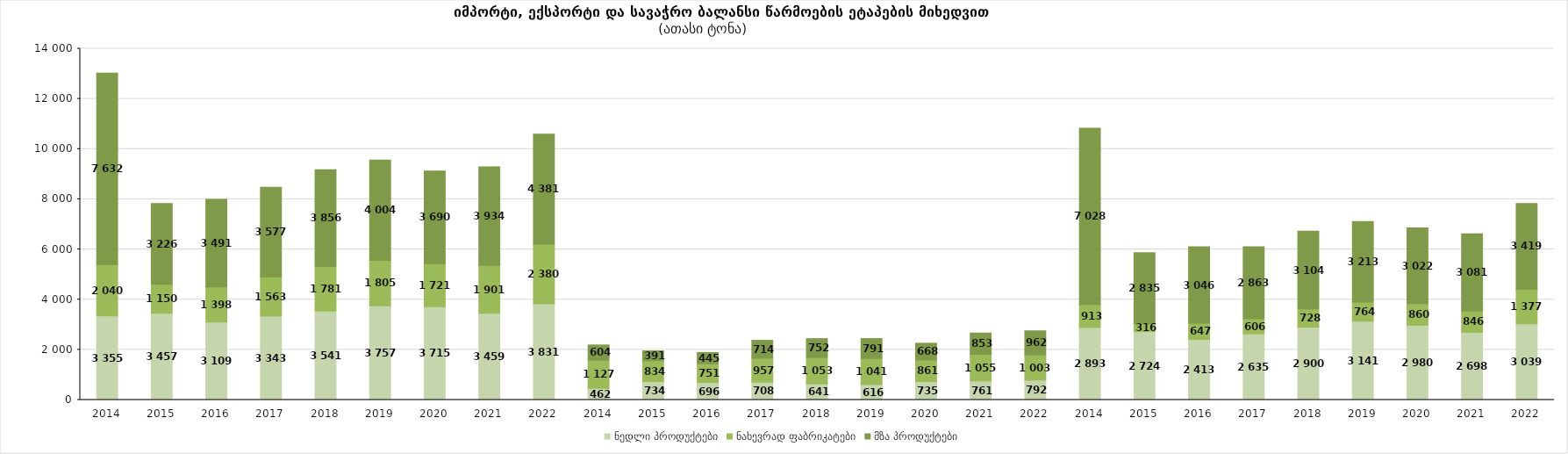
| Category | ნედლი პროდუქტები | ნახევრად ფაბრიკატები | მზა პროდუქტები |
|---|---|---|---|
| 2014.0 | 3355 | 2040 | 7632 |
| 2015.0 | 3457 | 1150 | 3226 |
| 2016.0 | 3109 | 1398 | 3491 |
| 2017.0 | 3343 | 1563 | 3577 |
| 2018.0 | 3541 | 1781 | 3856 |
| 2019.0 | 3757 | 1805 | 4004 |
| 2020.0 | 3715 | 1721 | 3690 |
| 2021.0 | 3459 | 1901 | 3934 |
| 2022.0 | 3831 | 2380 | 4381 |
| 2014.0 | 462 | 1127 | 604 |
| 2015.0 | 734 | 834 | 391 |
| 2016.0 | 696 | 751 | 445 |
| 2017.0 | 708 | 957 | 714 |
| 2018.0 | 641 | 1053 | 752 |
| 2019.0 | 616 | 1041 | 791 |
| 2020.0 | 735 | 861 | 668 |
| 2021.0 | 761 | 1055 | 853 |
| 2022.0 | 792 | 1003 | 962 |
| 2014.0 | 2893 | 913 | 7028 |
| 2015.0 | 2724 | 316 | 2835 |
| 2016.0 | 2413 | 647 | 3046 |
| 2017.0 | 2635 | 606 | 2863 |
| 2018.0 | 2900 | 728 | 3104 |
| 2019.0 | 3141 | 764 | 3213 |
| 2020.0 | 2980 | 860 | 3022 |
| 2021.0 | 2698 | 846 | 3081 |
| 2022.0 | 3039 | 1377 | 3419 |